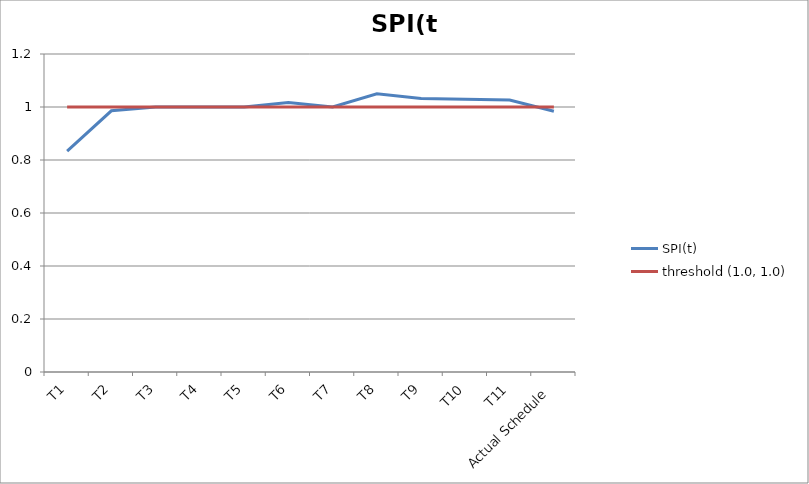
| Category | SPI(t) | threshold (1.0, 1.0) |
|---|---|---|
| T1 | 0.833 | 1 |
| T2 | 0.986 | 1 |
| T3 | 1 | 1 |
| T4 | 1 | 1 |
| T5 | 1 | 1 |
| T6 | 1.017 | 1 |
| T7 | 1 | 1 |
| T8 | 1.05 | 1 |
| T9 | 1.032 | 1 |
| T10 | 1.029 | 1 |
| T11 | 1.027 | 1 |
| Actual Schedule | 0.984 | 1 |